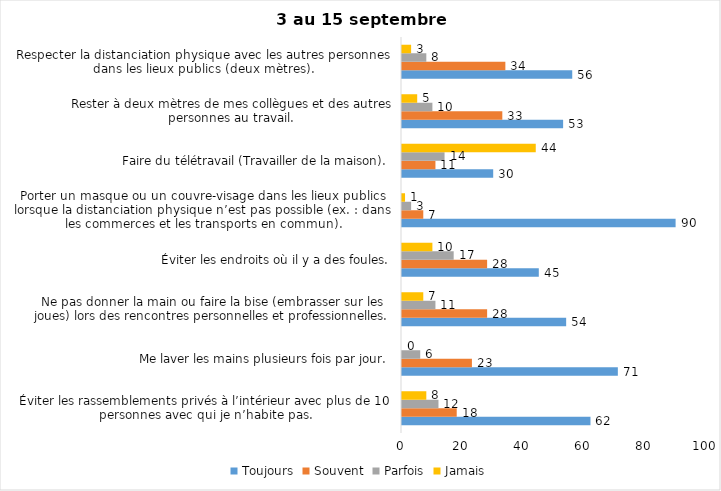
| Category | Toujours | Souvent | Parfois | Jamais |
|---|---|---|---|---|
| Éviter les rassemblements privés à l’intérieur avec plus de 10 personnes avec qui je n’habite pas. | 62 | 18 | 12 | 8 |
| Me laver les mains plusieurs fois par jour. | 71 | 23 | 6 | 0 |
| Ne pas donner la main ou faire la bise (embrasser sur les joues) lors des rencontres personnelles et professionnelles. | 54 | 28 | 11 | 7 |
| Éviter les endroits où il y a des foules. | 45 | 28 | 17 | 10 |
| Porter un masque ou un couvre-visage dans les lieux publics lorsque la distanciation physique n’est pas possible (ex. : dans les commerces et les transports en commun). | 90 | 7 | 3 | 1 |
| Faire du télétravail (Travailler de la maison). | 30 | 11 | 14 | 44 |
| Rester à deux mètres de mes collègues et des autres personnes au travail. | 53 | 33 | 10 | 5 |
| Respecter la distanciation physique avec les autres personnes dans les lieux publics (deux mètres). | 56 | 34 | 8 | 3 |